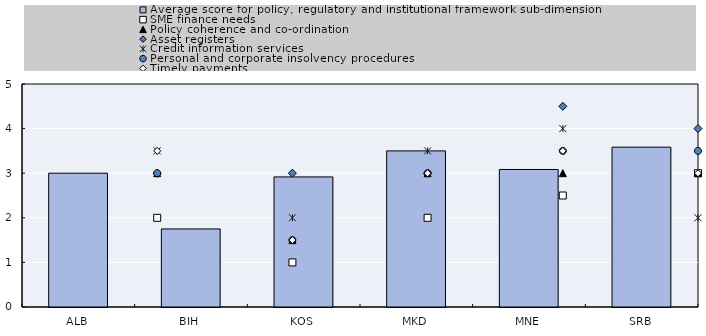
| Category | Average score for policy, regulatory and institutional framework sub-dimension |
|---|---|
| ALB | 3 |
| BIH | 1.75 |
| KOS | 2.917 |
| MKD | 3.5 |
| MNE | 3.083 |
| SRB | 3.583 |